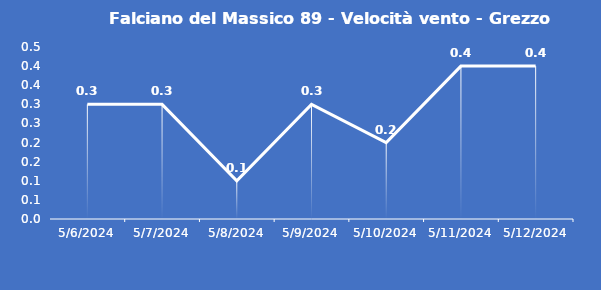
| Category | Falciano del Massico 89 - Velocità vento - Grezzo (m/s) |
|---|---|
| 5/6/24 | 0.3 |
| 5/7/24 | 0.3 |
| 5/8/24 | 0.1 |
| 5/9/24 | 0.3 |
| 5/10/24 | 0.2 |
| 5/11/24 | 0.4 |
| 5/12/24 | 0.4 |